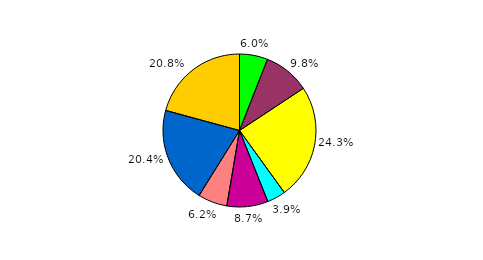
| Category | Series 0 |
|---|---|
| 0 | 5.951 |
| 1 | 9.762 |
| 2 | 24.326 |
| 3 | 3.925 |
| 4 | 8.693 |
| 5 | 6.19 |
| 6 | 20.378 |
| 7 | 20.776 |